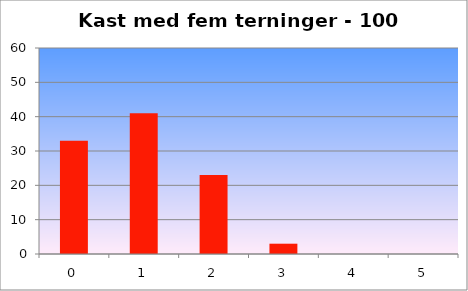
| Category | Series 0 |
|---|---|
| 0.0 | 33 |
| 1.0 | 41 |
| 2.0 | 23 |
| 3.0 | 3 |
| 4.0 | 0 |
| 5.0 | 0 |